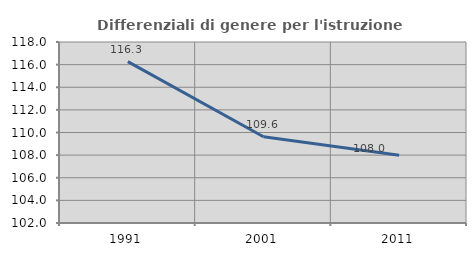
| Category | Differenziali di genere per l'istruzione superiore |
|---|---|
| 1991.0 | 116.27 |
| 2001.0 | 109.623 |
| 2011.0 | 107.983 |